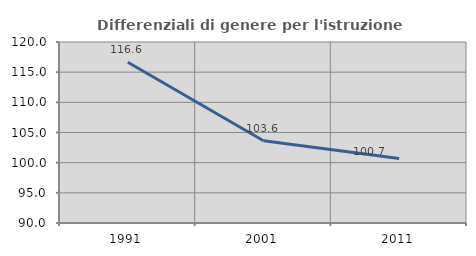
| Category | Differenziali di genere per l'istruzione superiore |
|---|---|
| 1991.0 | 116.646 |
| 2001.0 | 103.642 |
| 2011.0 | 100.675 |